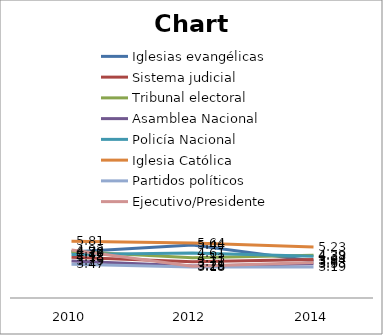
| Category | Iglesias evangélicas | Sistema judicial | Tribunal electoral | Asamblea Nacional | Policía Nacional | Iglesia Católica | Partidos políticos | Ejecutivo/Presidente |
|---|---|---|---|---|---|---|---|---|
| 2010.0 | 4.72 | 4.18 | 4.76 | 3.79 | 4.47 | 5.81 | 3.47 | 4.92 |
| 2012.0 | 5.44 | 3.71 | 4.13 | 3.28 | 4.61 | 5.64 | 3.18 | 3.25 |
| 2014.0 | 3.8 | 3.94 | 4.39 | 3.5 | 4.28 | 5.23 | 3.19 | 3.63 |